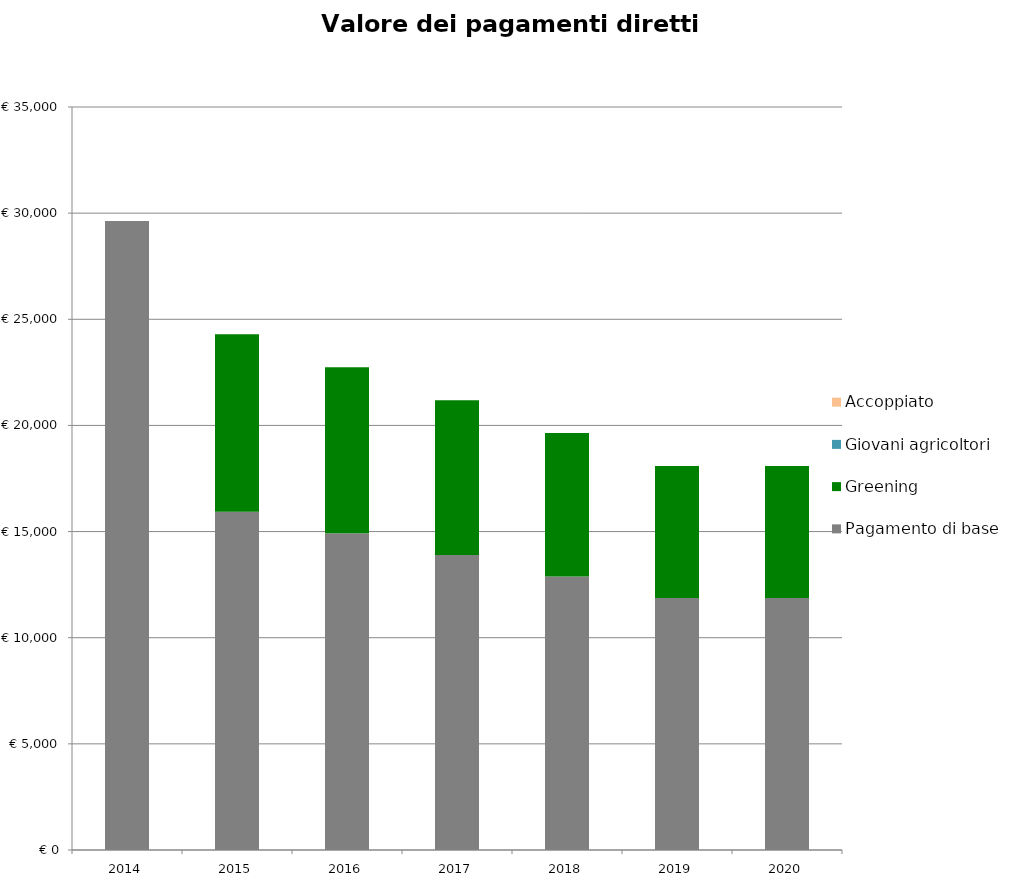
| Category | Pagamento di base | Greening | Giovani agricoltori | Accoppiato |
|---|---|---|---|---|
| 2014.0 | 29635.38 | 0 | 0 | 0 |
| 2015.0 | 15932.973 | 8357.177 | 0 | 0 |
| 2016.0 | 14915.975 | 7823.74 | 0 | 0 |
| 2017.0 | 13898.976 | 7290.303 | 0 | 0 |
| 2018.0 | 12881.978 | 6756.867 | 0 | 0 |
| 2019.0 | 11864.98 | 6223.43 | 0 | 0 |
| 2020.0 | 11864.98 | 6223.43 | 0 | 0 |